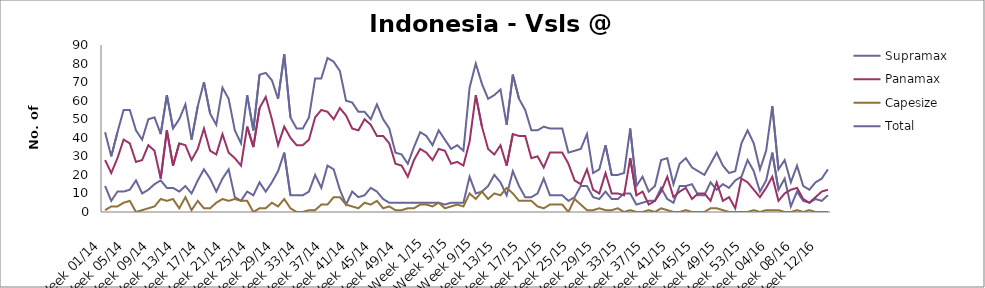
| Category | Supramax | Panamax | Capesize | Total |
|---|---|---|---|---|
| Week 01/14 | 14 | 28 | 1 | 43 |
| Week 02/14 | 6 | 21 | 3 | 30 |
| Week 03/14 | 11 | 29 | 3 | 43 |
| Week 04/14 | 11 | 39 | 5 | 55 |
| Week 05/14 | 12 | 37 | 6 | 55 |
| Week 06/14 | 17 | 27 | 0 | 44 |
| Week 07/14 | 10 | 28 | 1 | 39 |
| Week 08/14 | 12 | 36 | 2 | 50 |
| Week 09/14 | 15 | 33 | 3 | 51 |
| Week 10/14 | 17 | 18 | 7 | 42 |
| Week 11/14 | 13 | 44 | 6 | 63 |
| Week 12/14 | 13 | 25 | 7 | 45 |
| Week 13/14 | 11 | 37 | 2 | 50 |
| Week 14/14 | 14 | 36 | 8 | 58 |
| Week 15/14 | 10 | 28 | 1 | 39 |
| Week 16/14 | 17 | 34 | 6 | 57 |
| Week 17/14 | 23 | 45 | 2 | 70 |
| Week 18/14 | 18 | 33 | 2 | 53 |
| Week 19/14 | 11 | 31 | 5 | 47 |
| Week 20/14 | 18 | 42 | 7 | 67 |
| Week 21/14 | 23 | 32 | 6 | 61 |
| Week 22/14 | 8 | 29 | 7 | 44 |
| Week 23/14 | 6 | 25 | 6 | 37 |
| Week 24/14 | 11 | 46 | 6 | 63 |
| Week 25/14 | 9 | 35 | 0 | 44 |
| Week 26/14 | 16 | 56 | 2 | 74 |
| Week 27/14 | 11 | 62 | 2 | 75 |
| Week 28/14 | 16 | 50 | 5 | 71 |
| Week 29/14 | 22 | 36 | 3 | 61 |
| Week 30/14 | 32 | 46 | 7 | 85 |
| Week 31/14 | 9 | 40 | 2 | 51 |
| Week 32/14 | 9 | 36 | 0 | 45 |
| Week 33/14 | 9 | 36 | 0 | 45 |
| Week 34/14 | 11 | 39 | 1 | 51 |
| Week 35/14 | 20 | 51 | 1 | 72 |
| Week 36/14 | 13 | 55 | 4 | 72 |
| Week 37/14 | 25 | 54 | 4 | 83 |
| Week 38/14 | 23 | 50 | 8 | 81 |
| Week 39/14 | 12 | 56 | 8 | 76 |
| Week 40/14 | 4 | 52 | 4 | 60 |
| Week 41/14 | 11 | 45 | 3 | 59 |
| Week 42/14 | 8 | 44 | 2 | 54 |
| Week 43/14 | 9 | 50 | 5 | 54 |
| Week 44/14 | 13 | 47 | 4 | 50 |
| Week 45/14 | 11 | 41 | 6 | 58 |
| Week 46/14 | 7 | 41 | 2 | 50 |
| Week 47/14 | 5 | 37 | 3 | 45 |
| Week 48/14 | 5 | 26 | 1 | 32 |
| Week 49/14 | 5 | 25 | 1 | 31 |
| Week 50/14 | 5 | 19 | 2 | 26 |
| Week 51/14 | 5 | 28 | 2 | 35 |
| Week 52/14 | 5 | 34 | 4 | 43 |
| Week 1/15 | 5 | 32 | 4 | 41 |
| Week 2/15 | 5 | 28 | 3 | 36 |
| Week 3/15 | 5 | 34 | 5 | 44 |
| Week 4/15 | 4 | 33 | 2 | 39 |
| Week 5/15 | 5 | 26 | 3 | 34 |
| Week 6/15 | 5 | 27 | 4 | 36 |
| Week 7/15 | 5 | 25 | 3 | 33 |
| Week 8/15 | 19 | 38 | 10 | 67 |
| Week 9/15 | 10 | 63 | 7 | 80 |
| Week 10/15 | 11 | 46 | 11 | 69 |
| Week 11/15 | 14 | 34 | 7 | 61 |
| Week 12/15 | 20 | 31 | 10 | 63 |
| Week 13/15 | 16 | 36 | 9 | 66 |
| Week 14/15 | 9 | 25 | 13 | 47 |
| Week 15/15 | 22 | 42 | 10 | 74 |
| Week 16/15 | 14 | 41 | 6 | 61 |
| Week 17/15 | 8 | 41 | 6 | 55 |
| Week 18/15 | 8 | 29 | 6 | 44 |
| Week 19/15 | 10 | 30 | 3 | 44 |
| Week 20/15 | 18 | 24 | 2 | 46 |
| Week 21/15 | 9 | 32 | 4 | 45 |
| Week 22/15 | 9 | 32 | 4 | 45 |
| Week 23/15 | 9 | 32 | 4 | 45 |
| Week 24/15 | 6 | 26 | 0 | 32 |
| Week 25/15 | 8 | 17 | 7 | 33 |
| Week 26/15 | 14 | 15 | 4 | 34 |
| Week 27/15 | 14 | 23 | 1 | 42 |
| Week 28/15 | 8 | 12 | 1 | 21 |
| Week 29/15 | 7 | 10 | 2 | 23 |
| Week 30/15 | 11 | 21 | 1 | 36 |
| Week 31/15 | 7 | 10 | 1 | 20 |
| Week 32/15 | 7 | 10 | 2 | 20 |
| Week 33/15 | 10 | 9 | 0 | 21 |
| Week 34/15 | 10 | 29 | 1 | 45 |
| Week 35/15 | 4 | 9 | 0 | 14 |
| Week 36/15 | 5 | 11 | 0 | 19 |
| Week 37/15 | 6 | 4 | 1 | 11 |
| Week 38/15 | 6 | 6 | 0 | 14 |
| Week 39/15 | 13 | 11 | 2 | 28 |
| Week 40/15 | 7 | 19 | 1 | 29 |
| Week 41/15 | 5 | 8 | 0 | 15 |
| Week 42/15 | 14 | 11 | 0 | 26 |
| Week 43/15 | 14 | 13 | 1 | 29 |
| Week 44/15 | 15 | 7 | 0 | 24 |
| Week 45/15 | 9 | 10 | 0 | 22 |
| Week 46/15 | 9 | 10 | 0 | 20 |
| Week 47/15 | 16 | 6 | 2 | 26 |
| Week 48/15 | 12 | 16 | 2 | 32 |
| Week 49/15 | 15 | 6 | 1 | 25 |
| Week 50/15 | 13 | 8 | 0 | 21 |
| Week 51/15 | 17 | 2 | 0 | 22 |
| Week 52/15 | 19 | 18 | 0 | 37 |
| Week 53/15 | 28 | 16 | 0 | 44 |
| Week 01/16 | 22 | 12 | 1 | 37 |
| Week 02/16 | 11 | 8 | 0 | 23 |
| Week 03/16 | 17 | 13 | 1 | 33 |
| Week 04/16 | 32 | 19 | 1 | 57 |
| Week 05/16 | 12 | 6 | 1 | 23 |
| Week 06/16 | 18 | 10 | 0 | 28 |
| Week 07/16 | 3 | 12 | 0 | 16 |
| Week 08/16 | 11 | 13 | 1 | 25 |
| Week 09/16 | 6 | 7 | 0 | 14 |
| Week 10/16 | 5 | 5 | 1 | 12 |
| Week 11/16 | 7 | 8 | 0 | 16 |
| Week 12/16 | 6 | 11 | 0 | 18 |
| Week 13/16 | 9 | 12 | 0 | 23 |